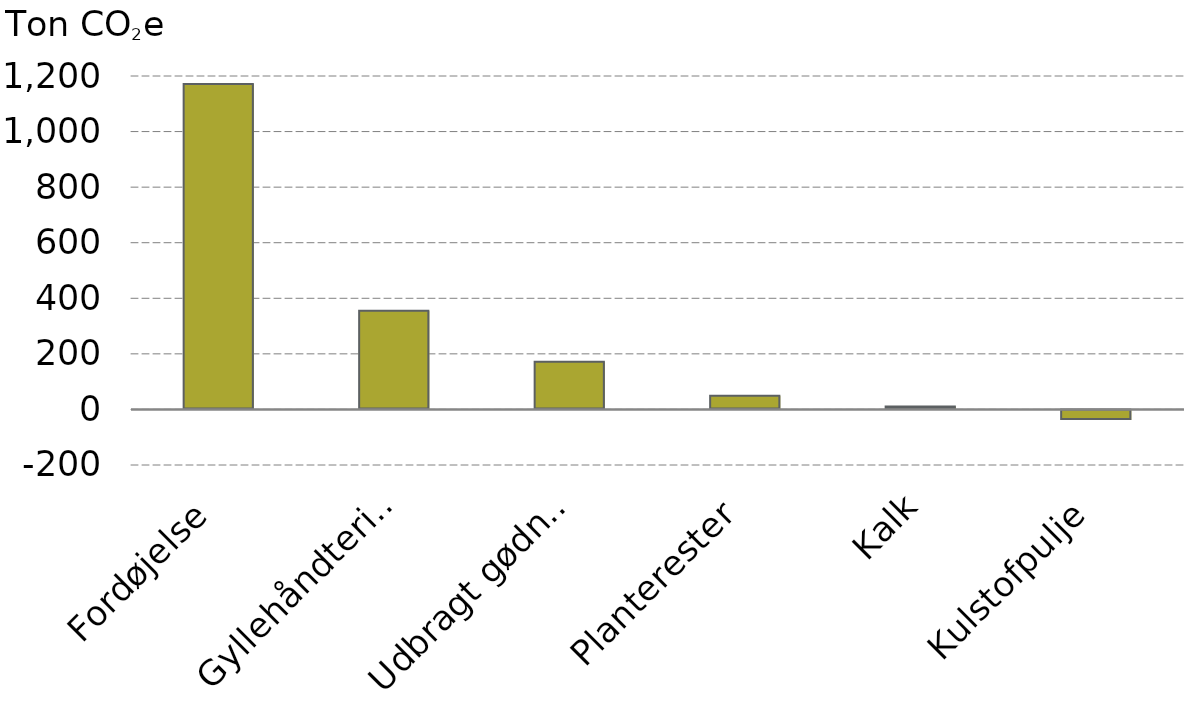
| Category |  Direkte udledninger  |
|---|---|
| Fordøjelse | 1171.449 |
| Gyllehåndtering | 355.5 |
| Udbragt gødning | 171.3 |
| Planterester | 49.55 |
| Kalk | 10.92 |
| Kulstofpulje | -37.8 |